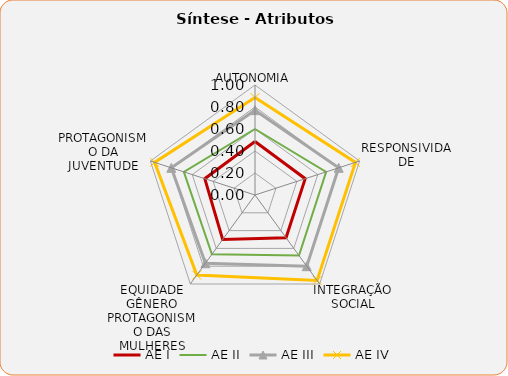
| Category | AE I | AE II | AE III | AE IV |
|---|---|---|---|---|
| AUTONOMIA | 0.486 | 0.6 | 0.771 | 0.886 |
| RESPONSIVIDADE | 0.48 | 0.68 | 0.8 | 0.96 |
| INTEGRAÇÃO SOCIAL | 0.48 | 0.68 | 0.8 | 0.96 |
| EQUIDADE GÊNERO PROTAGONISMO DAS MULHERES | 0.5 | 0.667 | 0.767 | 0.9 |
| PROTAGONISMO DA JUVENTUDE | 0.48 | 0.68 | 0.8 | 0.96 |